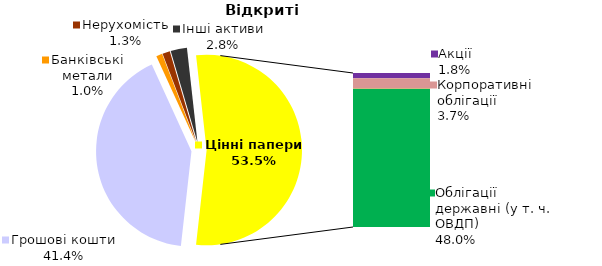
| Category | Відкриті |
|---|---|
| Грошові кошти | 834.293 |
| Банківські метали | 20.695 |
| Нерухомість | 25.604 |
| Інші активи | 55.683 |
| Акції | 36.057 |
| Корпоративні облігації | 74.801 |
| Облігації місцевих рад | 0.483 |
| Облігації державні (у т. ч. ОВДП) | 967.577 |